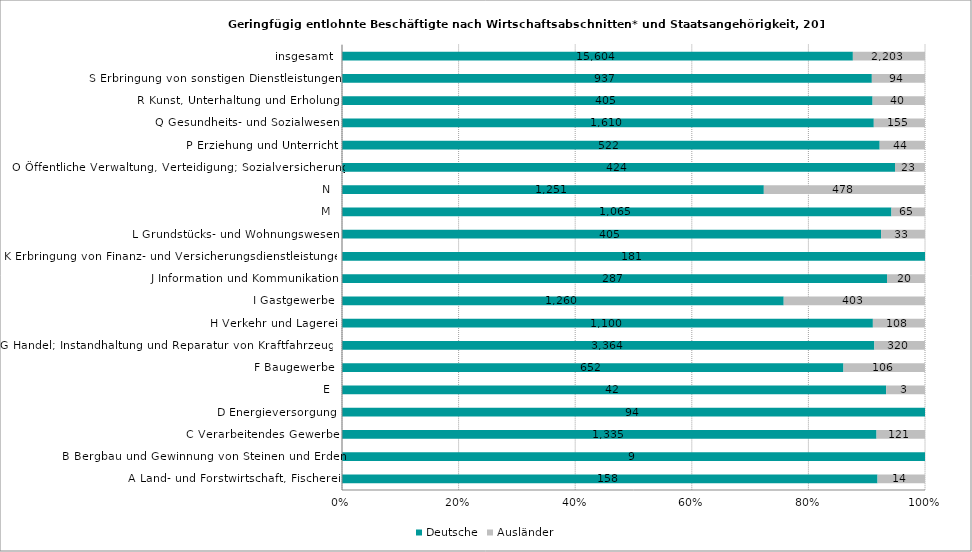
| Category | Deutsche | Ausländer |
|---|---|---|
| A Land- und Forstwirtschaft, Fischerei | 158 | 14 |
| B Bergbau und Gewinnung von Steinen und Erden | 9 | 0 |
| C Verarbeitendes Gewerbe | 1335 | 121 |
| D Energieversorgung | 94 | 0 |
| E | 42 | 3 |
| F Baugewerbe | 652 | 106 |
| G Handel; Instandhaltung und Reparatur von Kraftfahrzeugen | 3364 | 320 |
| H Verkehr und Lagerei | 1100 | 108 |
| I Gastgewerbe | 1260 | 403 |
| J Information und Kommunikation | 287 | 20 |
| K Erbringung von Finanz- und Versicherungsdienstleistungen | 181 | 0 |
| L Grundstücks- und Wohnungswesen | 405 | 33 |
| M | 1065 | 65 |
| N | 1251 | 478 |
| O Öffentliche Verwaltung, Verteidigung; Sozialversicherung | 424 | 23 |
| P Erziehung und Unterricht | 522 | 44 |
| Q Gesundheits- und Sozialwesen | 1610 | 155 |
| R Kunst, Unterhaltung und Erholung | 405 | 40 |
| S Erbringung von sonstigen Dienstleistungen | 937 | 94 |
| insgesamt | 15604 | 2203 |